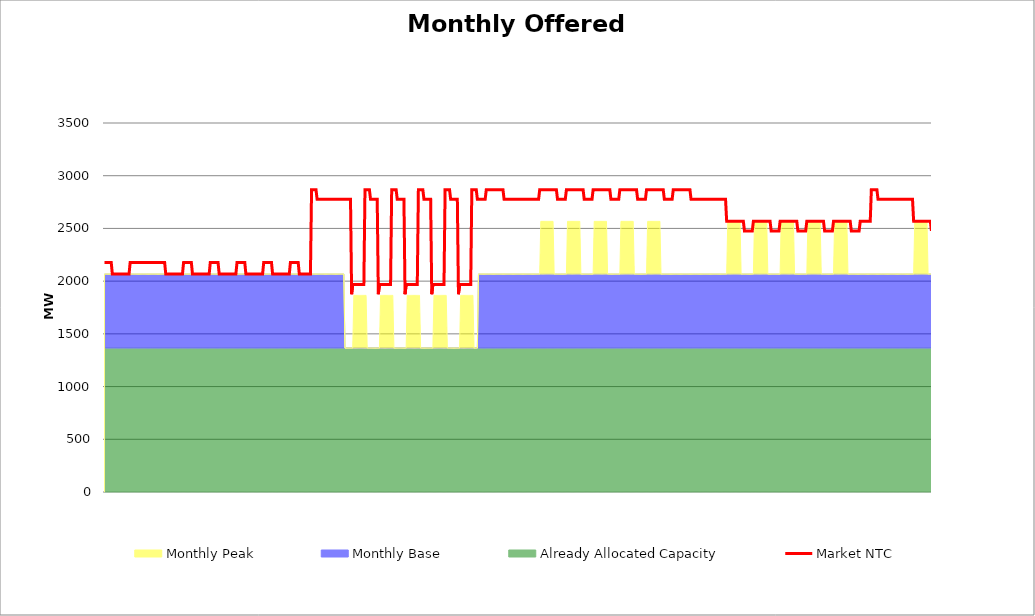
| Category | Market NTC |
|---|---|
| 0 | 2176 |
| 1 | 2176 |
| 2 | 2176 |
| 3 | 2176 |
| 4 | 2176 |
| 5 | 2176 |
| 6 | 2176 |
| 7 | 2067 |
| 8 | 2067 |
| 9 | 2067 |
| 10 | 2067 |
| 11 | 2067 |
| 12 | 2067 |
| 13 | 2067 |
| 14 | 2067 |
| 15 | 2067 |
| 16 | 2067 |
| 17 | 2067 |
| 18 | 2067 |
| 19 | 2067 |
| 20 | 2067 |
| 21 | 2067 |
| 22 | 2067 |
| 23 | 2176 |
| 24 | 2176 |
| 25 | 2176 |
| 26 | 2176 |
| 27 | 2176 |
| 28 | 2176 |
| 29 | 2176 |
| 30 | 2176 |
| 31 | 2176 |
| 32 | 2176 |
| 33 | 2176 |
| 34 | 2176 |
| 35 | 2176 |
| 36 | 2176 |
| 37 | 2176 |
| 38 | 2176 |
| 39 | 2176 |
| 40 | 2176 |
| 41 | 2176 |
| 42 | 2176 |
| 43 | 2176 |
| 44 | 2176 |
| 45 | 2176 |
| 46 | 2176 |
| 47 | 2176 |
| 48 | 2176 |
| 49 | 2176 |
| 50 | 2176 |
| 51 | 2176 |
| 52 | 2176 |
| 53 | 2176 |
| 54 | 2176 |
| 55 | 2067 |
| 56 | 2067 |
| 57 | 2067 |
| 58 | 2067 |
| 59 | 2067 |
| 60 | 2067 |
| 61 | 2067 |
| 62 | 2067 |
| 63 | 2067 |
| 64 | 2067 |
| 65 | 2067 |
| 66 | 2067 |
| 67 | 2067 |
| 68 | 2067 |
| 69 | 2067 |
| 70 | 2067 |
| 71 | 2176 |
| 72 | 2176 |
| 73 | 2176 |
| 74 | 2176 |
| 75 | 2176 |
| 76 | 2176 |
| 77 | 2176 |
| 78 | 2176 |
| 79 | 2067 |
| 80 | 2067 |
| 81 | 2067 |
| 82 | 2067 |
| 83 | 2067 |
| 84 | 2067 |
| 85 | 2067 |
| 86 | 2067 |
| 87 | 2067 |
| 88 | 2067 |
| 89 | 2067 |
| 90 | 2067 |
| 91 | 2067 |
| 92 | 2067 |
| 93 | 2067 |
| 94 | 2067 |
| 95 | 2176 |
| 96 | 2176 |
| 97 | 2176 |
| 98 | 2176 |
| 99 | 2176 |
| 100 | 2176 |
| 101 | 2176 |
| 102 | 2176 |
| 103 | 2067 |
| 104 | 2067 |
| 105 | 2067 |
| 106 | 2067 |
| 107 | 2067 |
| 108 | 2067 |
| 109 | 2067 |
| 110 | 2067 |
| 111 | 2067 |
| 112 | 2067 |
| 113 | 2067 |
| 114 | 2067 |
| 115 | 2067 |
| 116 | 2067 |
| 117 | 2067 |
| 118 | 2067 |
| 119 | 2176 |
| 120 | 2176 |
| 121 | 2176 |
| 122 | 2176 |
| 123 | 2176 |
| 124 | 2176 |
| 125 | 2176 |
| 126 | 2176 |
| 127 | 2067 |
| 128 | 2067 |
| 129 | 2067 |
| 130 | 2067 |
| 131 | 2067 |
| 132 | 2067 |
| 133 | 2067 |
| 134 | 2067 |
| 135 | 2067 |
| 136 | 2067 |
| 137 | 2067 |
| 138 | 2067 |
| 139 | 2067 |
| 140 | 2067 |
| 141 | 2067 |
| 142 | 2067 |
| 143 | 2176 |
| 144 | 2176 |
| 145 | 2176 |
| 146 | 2176 |
| 147 | 2176 |
| 148 | 2176 |
| 149 | 2176 |
| 150 | 2176 |
| 151 | 2067 |
| 152 | 2067 |
| 153 | 2067 |
| 154 | 2067 |
| 155 | 2067 |
| 156 | 2067 |
| 157 | 2067 |
| 158 | 2067 |
| 159 | 2067 |
| 160 | 2067 |
| 161 | 2067 |
| 162 | 2067 |
| 163 | 2067 |
| 164 | 2067 |
| 165 | 2067 |
| 166 | 2067 |
| 167 | 2176 |
| 168 | 2176 |
| 169 | 2176 |
| 170 | 2176 |
| 171 | 2176 |
| 172 | 2176 |
| 173 | 2176 |
| 174 | 2176 |
| 175 | 2067 |
| 176 | 2067 |
| 177 | 2067 |
| 178 | 2067 |
| 179 | 2067 |
| 180 | 2067 |
| 181 | 2067 |
| 182 | 2067 |
| 183 | 2067 |
| 184 | 2067 |
| 185 | 2067 |
| 186 | 2867 |
| 187 | 2867 |
| 188 | 2867 |
| 189 | 2867 |
| 190 | 2867 |
| 191 | 2776 |
| 192 | 2776 |
| 193 | 2776 |
| 194 | 2776 |
| 195 | 2776 |
| 196 | 2776 |
| 197 | 2776 |
| 198 | 2776 |
| 199 | 2776 |
| 200 | 2776 |
| 201 | 2776 |
| 202 | 2776 |
| 203 | 2776 |
| 204 | 2776 |
| 205 | 2776 |
| 206 | 2776 |
| 207 | 2776 |
| 208 | 2776 |
| 209 | 2776 |
| 210 | 2776 |
| 211 | 2776 |
| 212 | 2776 |
| 213 | 2776 |
| 214 | 2776 |
| 215 | 2776 |
| 216 | 2776 |
| 217 | 2776 |
| 218 | 2776 |
| 219 | 2776 |
| 220 | 2776 |
| 221 | 2776 |
| 222 | 1876 |
| 223 | 1967 |
| 224 | 1967 |
| 225 | 1967 |
| 226 | 1967 |
| 227 | 1967 |
| 228 | 1967 |
| 229 | 1967 |
| 230 | 1967 |
| 231 | 1967 |
| 232 | 1967 |
| 233 | 1967 |
| 234 | 2867 |
| 235 | 2867 |
| 236 | 2867 |
| 237 | 2867 |
| 238 | 2867 |
| 239 | 2776 |
| 240 | 2776 |
| 241 | 2776 |
| 242 | 2776 |
| 243 | 2776 |
| 244 | 2776 |
| 245 | 2776 |
| 246 | 1876 |
| 247 | 1967 |
| 248 | 1967 |
| 249 | 1967 |
| 250 | 1967 |
| 251 | 1967 |
| 252 | 1967 |
| 253 | 1967 |
| 254 | 1967 |
| 255 | 1967 |
| 256 | 1967 |
| 257 | 1967 |
| 258 | 2867 |
| 259 | 2867 |
| 260 | 2867 |
| 261 | 2867 |
| 262 | 2867 |
| 263 | 2776 |
| 264 | 2776 |
| 265 | 2776 |
| 266 | 2776 |
| 267 | 2776 |
| 268 | 2776 |
| 269 | 2776 |
| 270 | 1876 |
| 271 | 1967 |
| 272 | 1967 |
| 273 | 1967 |
| 274 | 1967 |
| 275 | 1967 |
| 276 | 1967 |
| 277 | 1967 |
| 278 | 1967 |
| 279 | 1967 |
| 280 | 1967 |
| 281 | 1967 |
| 282 | 2867 |
| 283 | 2867 |
| 284 | 2867 |
| 285 | 2867 |
| 286 | 2867 |
| 287 | 2776 |
| 288 | 2776 |
| 289 | 2776 |
| 290 | 2776 |
| 291 | 2776 |
| 292 | 2776 |
| 293 | 2776 |
| 294 | 1876 |
| 295 | 1967 |
| 296 | 1967 |
| 297 | 1967 |
| 298 | 1967 |
| 299 | 1967 |
| 300 | 1967 |
| 301 | 1967 |
| 302 | 1967 |
| 303 | 1967 |
| 304 | 1967 |
| 305 | 1967 |
| 306 | 2867 |
| 307 | 2867 |
| 308 | 2867 |
| 309 | 2867 |
| 310 | 2867 |
| 311 | 2776 |
| 312 | 2776 |
| 313 | 2776 |
| 314 | 2776 |
| 315 | 2776 |
| 316 | 2776 |
| 317 | 2776 |
| 318 | 1876 |
| 319 | 1967 |
| 320 | 1967 |
| 321 | 1967 |
| 322 | 1967 |
| 323 | 1967 |
| 324 | 1967 |
| 325 | 1967 |
| 326 | 1967 |
| 327 | 1967 |
| 328 | 1967 |
| 329 | 1967 |
| 330 | 2867 |
| 331 | 2867 |
| 332 | 2867 |
| 333 | 2867 |
| 334 | 2867 |
| 335 | 2776 |
| 336 | 2776 |
| 337 | 2776 |
| 338 | 2776 |
| 339 | 2776 |
| 340 | 2776 |
| 341 | 2776 |
| 342 | 2776 |
| 343 | 2867 |
| 344 | 2867 |
| 345 | 2867 |
| 346 | 2867 |
| 347 | 2867 |
| 348 | 2867 |
| 349 | 2867 |
| 350 | 2867 |
| 351 | 2867 |
| 352 | 2867 |
| 353 | 2867 |
| 354 | 2867 |
| 355 | 2867 |
| 356 | 2867 |
| 357 | 2867 |
| 358 | 2867 |
| 359 | 2776 |
| 360 | 2776 |
| 361 | 2776 |
| 362 | 2776 |
| 363 | 2776 |
| 364 | 2776 |
| 365 | 2776 |
| 366 | 2776 |
| 367 | 2776 |
| 368 | 2776 |
| 369 | 2776 |
| 370 | 2776 |
| 371 | 2776 |
| 372 | 2776 |
| 373 | 2776 |
| 374 | 2776 |
| 375 | 2776 |
| 376 | 2776 |
| 377 | 2776 |
| 378 | 2776 |
| 379 | 2776 |
| 380 | 2776 |
| 381 | 2776 |
| 382 | 2776 |
| 383 | 2776 |
| 384 | 2776 |
| 385 | 2776 |
| 386 | 2776 |
| 387 | 2776 |
| 388 | 2776 |
| 389 | 2776 |
| 390 | 2776 |
| 391 | 2867 |
| 392 | 2867 |
| 393 | 2867 |
| 394 | 2867 |
| 395 | 2867 |
| 396 | 2867 |
| 397 | 2867 |
| 398 | 2867 |
| 399 | 2867 |
| 400 | 2867 |
| 401 | 2867 |
| 402 | 2867 |
| 403 | 2867 |
| 404 | 2867 |
| 405 | 2867 |
| 406 | 2867 |
| 407 | 2776 |
| 408 | 2776 |
| 409 | 2776 |
| 410 | 2776 |
| 411 | 2776 |
| 412 | 2776 |
| 413 | 2776 |
| 414 | 2776 |
| 415 | 2867 |
| 416 | 2867 |
| 417 | 2867 |
| 418 | 2867 |
| 419 | 2867 |
| 420 | 2867 |
| 421 | 2867 |
| 422 | 2867 |
| 423 | 2867 |
| 424 | 2867 |
| 425 | 2867 |
| 426 | 2867 |
| 427 | 2867 |
| 428 | 2867 |
| 429 | 2867 |
| 430 | 2867 |
| 431 | 2776 |
| 432 | 2776 |
| 433 | 2776 |
| 434 | 2776 |
| 435 | 2776 |
| 436 | 2776 |
| 437 | 2776 |
| 438 | 2776 |
| 439 | 2867 |
| 440 | 2867 |
| 441 | 2867 |
| 442 | 2867 |
| 443 | 2867 |
| 444 | 2867 |
| 445 | 2867 |
| 446 | 2867 |
| 447 | 2867 |
| 448 | 2867 |
| 449 | 2867 |
| 450 | 2867 |
| 451 | 2867 |
| 452 | 2867 |
| 453 | 2867 |
| 454 | 2867 |
| 455 | 2776 |
| 456 | 2776 |
| 457 | 2776 |
| 458 | 2776 |
| 459 | 2776 |
| 460 | 2776 |
| 461 | 2776 |
| 462 | 2776 |
| 463 | 2867 |
| 464 | 2867 |
| 465 | 2867 |
| 466 | 2867 |
| 467 | 2867 |
| 468 | 2867 |
| 469 | 2867 |
| 470 | 2867 |
| 471 | 2867 |
| 472 | 2867 |
| 473 | 2867 |
| 474 | 2867 |
| 475 | 2867 |
| 476 | 2867 |
| 477 | 2867 |
| 478 | 2867 |
| 479 | 2776 |
| 480 | 2776 |
| 481 | 2776 |
| 482 | 2776 |
| 483 | 2776 |
| 484 | 2776 |
| 485 | 2776 |
| 486 | 2776 |
| 487 | 2867 |
| 488 | 2867 |
| 489 | 2867 |
| 490 | 2867 |
| 491 | 2867 |
| 492 | 2867 |
| 493 | 2867 |
| 494 | 2867 |
| 495 | 2867 |
| 496 | 2867 |
| 497 | 2867 |
| 498 | 2867 |
| 499 | 2867 |
| 500 | 2867 |
| 501 | 2867 |
| 502 | 2867 |
| 503 | 2776 |
| 504 | 2776 |
| 505 | 2776 |
| 506 | 2776 |
| 507 | 2776 |
| 508 | 2776 |
| 509 | 2776 |
| 510 | 2776 |
| 511 | 2867 |
| 512 | 2867 |
| 513 | 2867 |
| 514 | 2867 |
| 515 | 2867 |
| 516 | 2867 |
| 517 | 2867 |
| 518 | 2867 |
| 519 | 2867 |
| 520 | 2867 |
| 521 | 2867 |
| 522 | 2867 |
| 523 | 2867 |
| 524 | 2867 |
| 525 | 2867 |
| 526 | 2867 |
| 527 | 2776 |
| 528 | 2776 |
| 529 | 2776 |
| 530 | 2776 |
| 531 | 2776 |
| 532 | 2776 |
| 533 | 2776 |
| 534 | 2776 |
| 535 | 2776 |
| 536 | 2776 |
| 537 | 2776 |
| 538 | 2776 |
| 539 | 2776 |
| 540 | 2776 |
| 541 | 2776 |
| 542 | 2776 |
| 543 | 2776 |
| 544 | 2776 |
| 545 | 2776 |
| 546 | 2776 |
| 547 | 2776 |
| 548 | 2776 |
| 549 | 2776 |
| 550 | 2776 |
| 551 | 2776 |
| 552 | 2776 |
| 553 | 2776 |
| 554 | 2776 |
| 555 | 2776 |
| 556 | 2776 |
| 557 | 2776 |
| 558 | 2776 |
| 559 | 2567 |
| 560 | 2567 |
| 561 | 2567 |
| 562 | 2567 |
| 563 | 2567 |
| 564 | 2567 |
| 565 | 2567 |
| 566 | 2567 |
| 567 | 2567 |
| 568 | 2567 |
| 569 | 2567 |
| 570 | 2567 |
| 571 | 2567 |
| 572 | 2567 |
| 573 | 2567 |
| 574 | 2567 |
| 575 | 2476 |
| 576 | 2476 |
| 577 | 2476 |
| 578 | 2476 |
| 579 | 2476 |
| 580 | 2476 |
| 581 | 2476 |
| 582 | 2476 |
| 583 | 2567 |
| 584 | 2567 |
| 585 | 2567 |
| 586 | 2567 |
| 587 | 2567 |
| 588 | 2567 |
| 589 | 2567 |
| 590 | 2567 |
| 591 | 2567 |
| 592 | 2567 |
| 593 | 2567 |
| 594 | 2567 |
| 595 | 2567 |
| 596 | 2567 |
| 597 | 2567 |
| 598 | 2567 |
| 599 | 2476 |
| 600 | 2476 |
| 601 | 2476 |
| 602 | 2476 |
| 603 | 2476 |
| 604 | 2476 |
| 605 | 2476 |
| 606 | 2476 |
| 607 | 2567 |
| 608 | 2567 |
| 609 | 2567 |
| 610 | 2567 |
| 611 | 2567 |
| 612 | 2567 |
| 613 | 2567 |
| 614 | 2567 |
| 615 | 2567 |
| 616 | 2567 |
| 617 | 2567 |
| 618 | 2567 |
| 619 | 2567 |
| 620 | 2567 |
| 621 | 2567 |
| 622 | 2567 |
| 623 | 2476 |
| 624 | 2476 |
| 625 | 2476 |
| 626 | 2476 |
| 627 | 2476 |
| 628 | 2476 |
| 629 | 2476 |
| 630 | 2476 |
| 631 | 2567 |
| 632 | 2567 |
| 633 | 2567 |
| 634 | 2567 |
| 635 | 2567 |
| 636 | 2567 |
| 637 | 2567 |
| 638 | 2567 |
| 639 | 2567 |
| 640 | 2567 |
| 641 | 2567 |
| 642 | 2567 |
| 643 | 2567 |
| 644 | 2567 |
| 645 | 2567 |
| 646 | 2567 |
| 647 | 2476 |
| 648 | 2476 |
| 649 | 2476 |
| 650 | 2476 |
| 651 | 2476 |
| 652 | 2476 |
| 653 | 2476 |
| 654 | 2476 |
| 655 | 2567 |
| 656 | 2567 |
| 657 | 2567 |
| 658 | 2567 |
| 659 | 2567 |
| 660 | 2567 |
| 661 | 2567 |
| 662 | 2567 |
| 663 | 2567 |
| 664 | 2567 |
| 665 | 2567 |
| 666 | 2567 |
| 667 | 2567 |
| 668 | 2567 |
| 669 | 2567 |
| 670 | 2567 |
| 671 | 2476 |
| 672 | 2476 |
| 673 | 2476 |
| 674 | 2476 |
| 675 | 2476 |
| 676 | 2476 |
| 677 | 2476 |
| 678 | 2476 |
| 679 | 2567 |
| 680 | 2567 |
| 681 | 2567 |
| 682 | 2567 |
| 683 | 2567 |
| 684 | 2567 |
| 685 | 2567 |
| 686 | 2567 |
| 687 | 2567 |
| 688 | 2567 |
| 689 | 2867 |
| 690 | 2867 |
| 691 | 2867 |
| 692 | 2867 |
| 693 | 2867 |
| 694 | 2867 |
| 695 | 2776 |
| 696 | 2776 |
| 697 | 2776 |
| 698 | 2776 |
| 699 | 2776 |
| 700 | 2776 |
| 701 | 2776 |
| 702 | 2776 |
| 703 | 2776 |
| 704 | 2776 |
| 705 | 2776 |
| 706 | 2776 |
| 707 | 2776 |
| 708 | 2776 |
| 709 | 2776 |
| 710 | 2776 |
| 711 | 2776 |
| 712 | 2776 |
| 713 | 2776 |
| 714 | 2776 |
| 715 | 2776 |
| 716 | 2776 |
| 717 | 2776 |
| 718 | 2776 |
| 719 | 2776 |
| 720 | 2776 |
| 721 | 2776 |
| 722 | 2776 |
| 723 | 2776 |
| 724 | 2776 |
| 725 | 2776 |
| 726 | 2776 |
| 727 | 2567 |
| 728 | 2567 |
| 729 | 2567 |
| 730 | 2567 |
| 731 | 2567 |
| 732 | 2567 |
| 733 | 2567 |
| 734 | 2567 |
| 735 | 2567 |
| 736 | 2567 |
| 737 | 2567 |
| 738 | 2567 |
| 739 | 2567 |
| 740 | 2567 |
| 741 | 2567 |
| 742 | 2567 |
| 743 | 2476 |